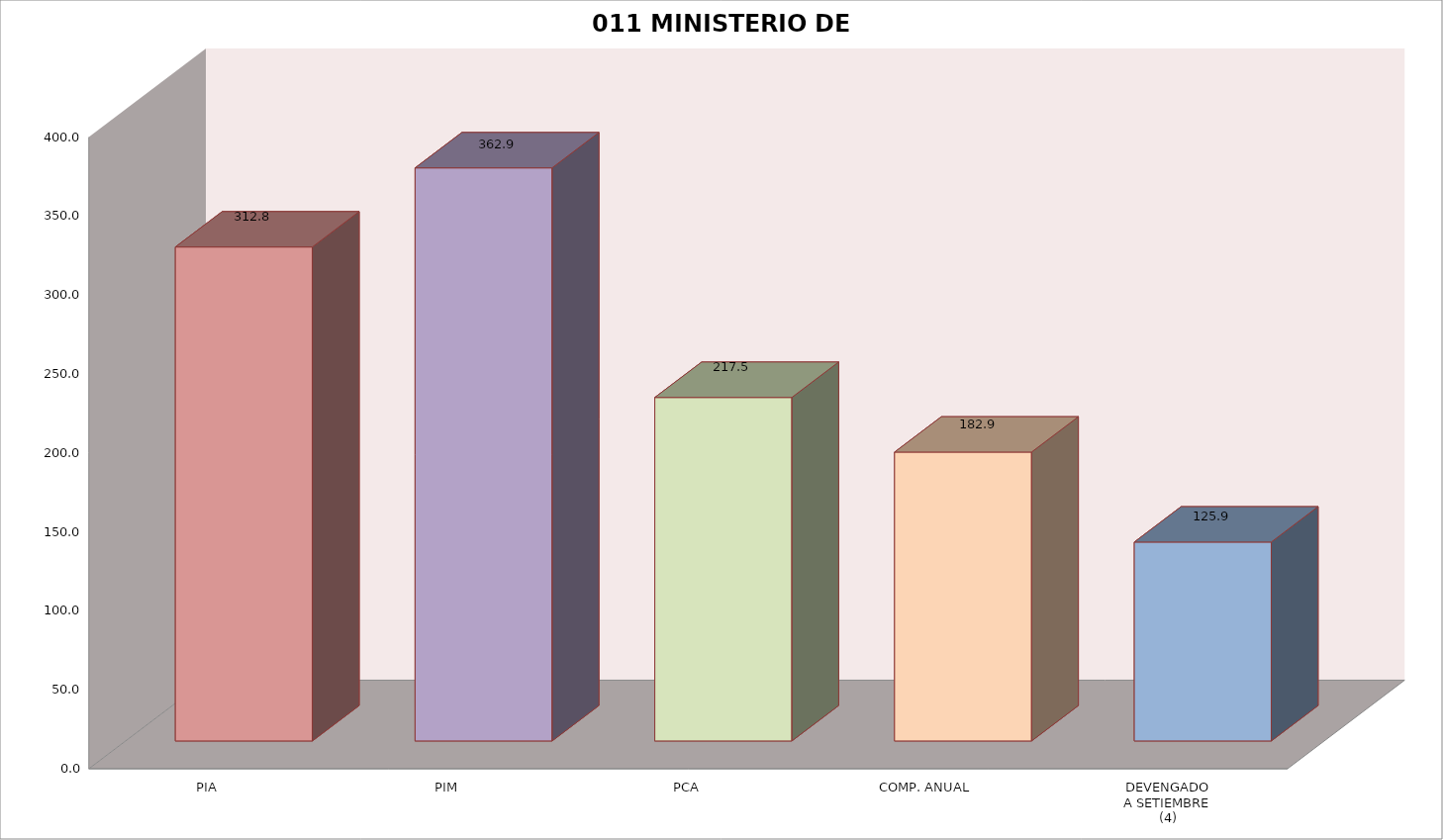
| Category | 011 MINISTERIO DE SALUD |
|---|---|
| PIA | 312.801 |
| PIM | 362.893 |
| PCA | 217.52 |
| COMP. ANUAL | 182.911 |
| DEVENGADO
A SETIEMBRE
(4) | 125.949 |